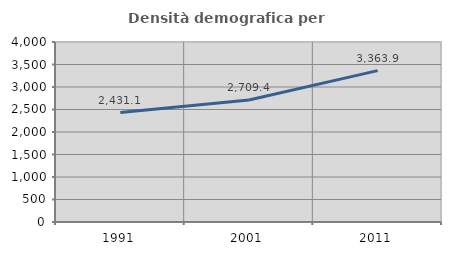
| Category | Densità demografica |
|---|---|
| 1991.0 | 2431.134 |
| 2001.0 | 2709.435 |
| 2011.0 | 3363.94 |